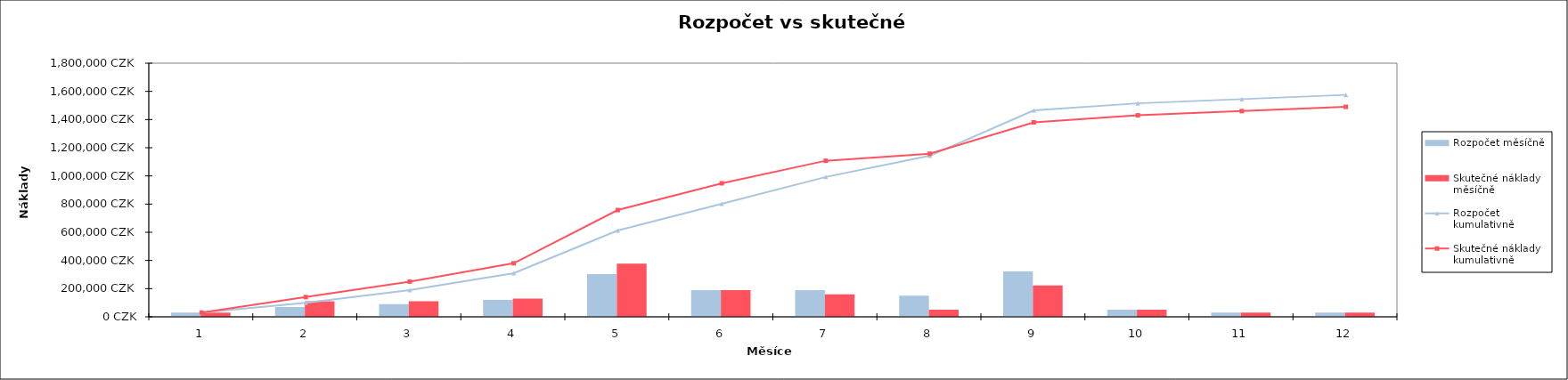
| Category | Rozpočet měsíčně | Skutečné náklady měsíčně |
|---|---|---|
| 0 | 30000 | 30000 |
| 1 | 70000 | 110000 |
| 2 | 90000 | 110000 |
| 3 | 120000 | 130000 |
| 4 | 302500 | 377500 |
| 5 | 190000 | 190000 |
| 6 | 190000 | 160000 |
| 7 | 150000 | 50000 |
| 8 | 322500 | 222500 |
| 9 | 50000 | 50000 |
| 10 | 30000 | 30000 |
| 11 | 30000 | 30000 |